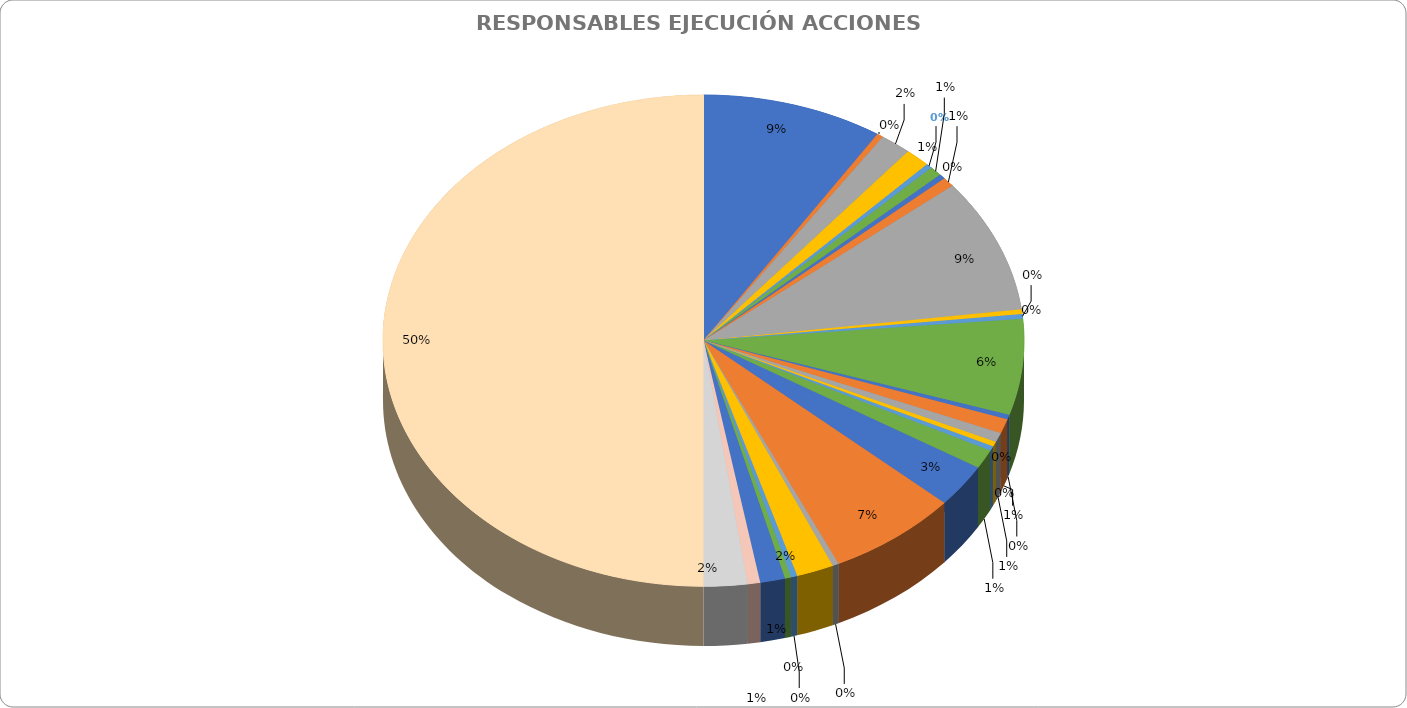
| Category | Cuenta de ESTADO DE LA ACCION |
|---|---|
| Dirección de Atención al Ciudadano | 29 |
| Dirección de Atención al Ciudadano/ Oficina de Tecnologías de la Información y las Comunicaciones | 1 |
| Dirección de Contratación | 5 |
| Dirección de Gestión de Cobro | 4 |
| Dirección de Gestión de Cobro /  Dirección de Talento Humano/  Dirección de Investigaciones Administrativas al Tránsito y Transporte /  Subdirección de Contravenciones de Tránsito/  Subdirección de Control e Investigaciones al Transporte Público. | 1 |
| Dirección de Inteligencia para la Movilidad | 2 |
| DIRECCIÓN DE NORMATIVIDAD Y CONCEPTOS
 DIRECCIÓN DE TALENTO HUMANO | 1 |
| DIRECCIÓN DE REPRESENTACIÓN JUDICIAL | 2 |
| DIRECCIÓN DE TALENTO HUMANO | 28 |
| DIRECCIÓN DE TALENTO HUMANO /  OFICINA ASESORA DE COMUNICACIONES Y CULTURA PARA LA MOVILIDAD | 1 |
| El(la) Subsecretario(a) de Gestión Corporativa, en representación del Secretario Distrital de Movilidad. 
 El(la) Director(a) Administrativo(a) y Financiero(a). 
 El(la) Director (a) de Investigaciones Administrativas al Tránsito y Transporte. 
 El(la) Su | 1 |
| GESTION ADMINISTRATIVA | 20 |
| GESTION ADMINISTRATIVA / 
 SUBDIRECCION DE CONTROL DE TRANSITO TRANSPORTE | 1 |
| Oficina Asesora de Comunicaciones y Cultura para la Movilidad | 3 |
| OFICINA ASESORA DE PLANEACIÓN INSTITUCIONAL | 2 |
| Oficina Asesora de Planeación Institucional
 Dirección de Contratación
 Subdirección Financiera
 Dirección de Atención al Ciudadano
 Oficina de Tecnologías de la Información y las Comunicaciones
 Dirección de Talento Humano | 1 |
| OFICINA DE CONTROL DISCIPLINARIO INTERNO | 1 |
| Oficina de Gestión Social | 4 |
| OFICINA DE TECNOLOGÍAS DE LA INFORMACIÓN Y LAS COMUNICACIONES | 9 |
| Subdirección Administrativa | 21 |
| Subdirección Administrativa / OTIC | 1 |
| Subdirección de Contravenciones | 6 |
| SUBDIRECCION DE CONTROL DE TRANSITO TRANSPORTE | 1 |
| SUBDIRECCIÓN DE SEÑALIZACIÓN | 1 |
| SUBDIRECCIÓN FINANCIERA | 4 |
| Subdirector de Control de Tránsito y Transporte | 2 |
| Subsecretaria de Gestion Corporativa | 7 |
| Total general | 159 |